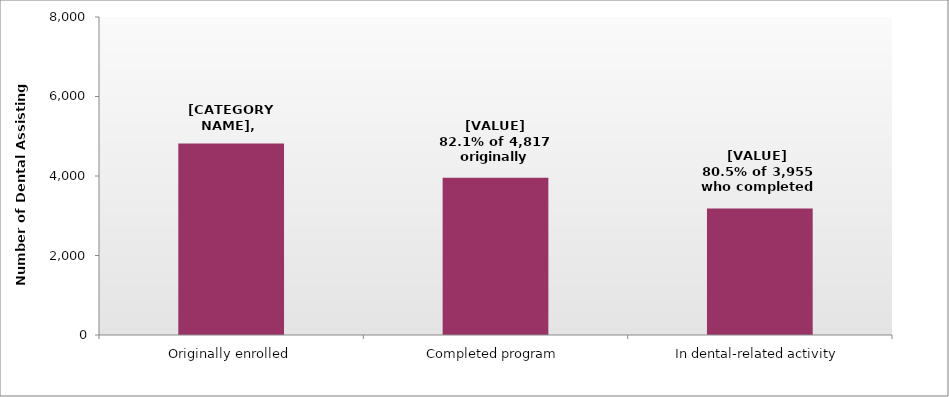
| Category | Series 0 |
|---|---|
| Originally enrolled | 4817 |
| Completed program | 3955 |
| In dental-related activity | 3183 |